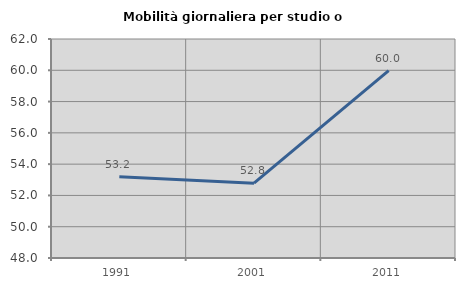
| Category | Mobilità giornaliera per studio o lavoro |
|---|---|
| 1991.0 | 53.2 |
| 2001.0 | 52.785 |
| 2011.0 | 59.975 |